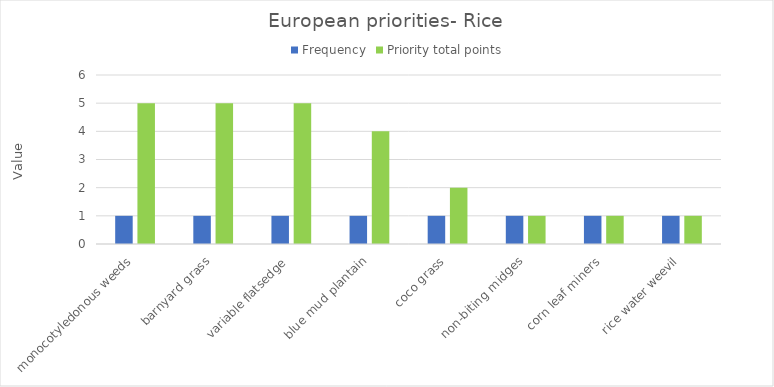
| Category | Frequency | Priority total points |
|---|---|---|
| monocotyledonous weeds | 1 | 5 |
| barnyard grass | 1 | 5 |
| variable flatsedge | 1 | 5 |
| blue mud plantain | 1 | 4 |
| coco grass | 1 | 2 |
| non-biting midges | 1 | 1 |
| corn leaf miners | 1 | 1 |
| rice water weevil | 1 | 1 |